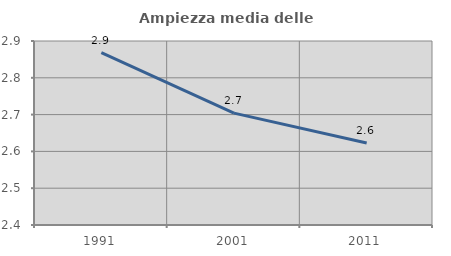
| Category | Ampiezza media delle famiglie |
|---|---|
| 1991.0 | 2.869 |
| 2001.0 | 2.704 |
| 2011.0 | 2.623 |